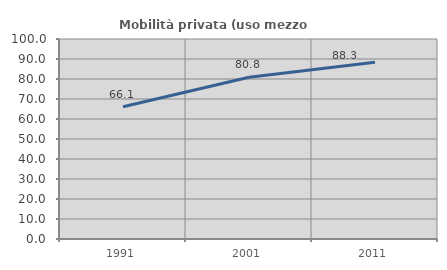
| Category | Mobilità privata (uso mezzo privato) |
|---|---|
| 1991.0 | 66.099 |
| 2001.0 | 80.844 |
| 2011.0 | 88.341 |